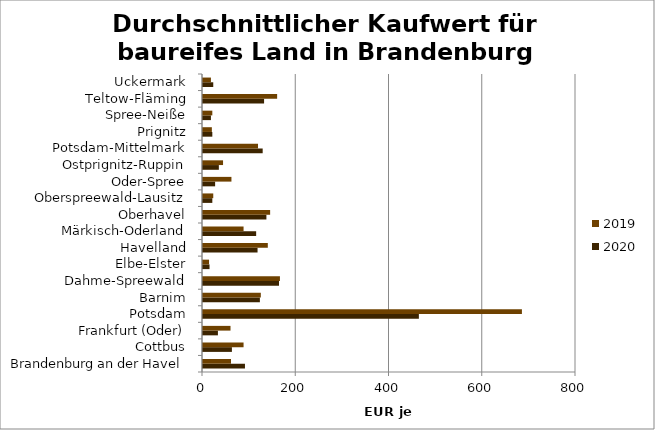
| Category | 2020 | 2019 |
|---|---|---|
| Brandenburg an der Havel | 90 | 60 |
| Cottbus | 62 | 87 |
| Frankfurt (Oder) | 32 | 59 |
| Potsdam | 463 | 684 |
| Barnim | 122 | 124 |
| Dahme-Spreewald | 163 | 165 |
| Elbe-Elster | 14 | 13 |
| Havelland | 117 | 139 |
| Märkisch-Oderland | 114 | 87 |
| Oberhavel | 136 | 144 |
| Oberspreewald-Lausitz | 20 | 22 |
| Oder-Spree | 26 | 61 |
| Ostprignitz-Ruppin | 34 | 43 |
| Potsdam-Mittelmark | 128 | 118 |
| Prignitz | 20 | 19 |
| Spree-Neiße | 17 | 20 |
| Teltow-Fläming | 131 | 159 |
| Uckermark | 22 | 17 |